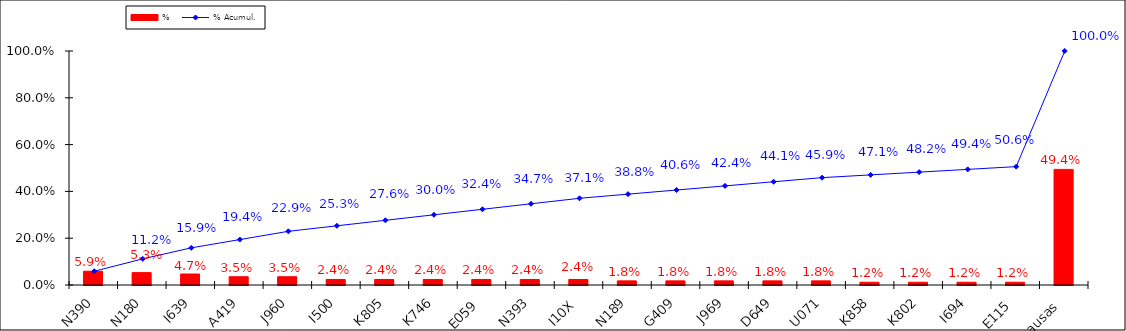
| Category | % |
|---|---|
| N390 | 0.059 |
| N180 | 0.053 |
| I639 | 0.047 |
| A419 | 0.035 |
| J960 | 0.035 |
| I500 | 0.024 |
| K805 | 0.024 |
| K746 | 0.024 |
| E059 | 0.024 |
| N393 | 0.024 |
| I10X | 0.024 |
| N189 | 0.018 |
| G409 | 0.018 |
| J969 | 0.018 |
| D649 | 0.018 |
| U071 | 0.018 |
| K858 | 0.012 |
| K802 | 0.012 |
| I694 | 0.012 |
| E115 | 0.012 |
| Otras causas | 0.494 |